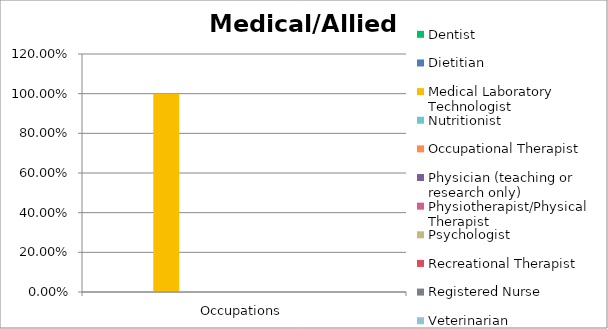
| Category | Dentist | Dietitian | Medical Laboratory Technologist | Nutritionist | Occupational Therapist | Physician (teaching or research only) | Physiotherapist/Physical Therapist | Psychologist | Recreational Therapist | Registered Nurse | Veterinarian |
|---|---|---|---|---|---|---|---|---|---|---|---|
| Occupations | 0 | 0 | 1 | 0 | 0 | 0 | 0 | 0 | 0 | 0 | 0 |